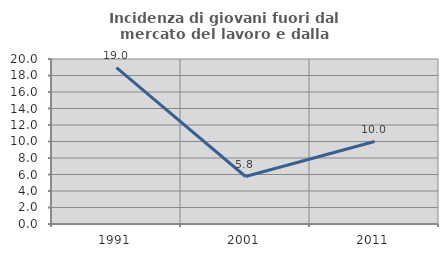
| Category | Incidenza di giovani fuori dal mercato del lavoro e dalla formazione  |
|---|---|
| 1991.0 | 18.954 |
| 2001.0 | 5.755 |
| 2011.0 | 10 |